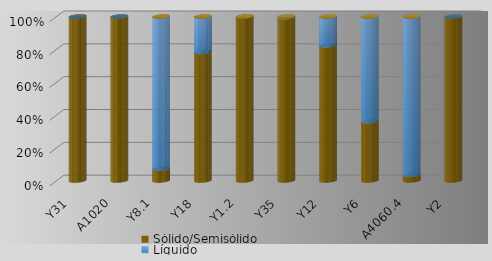
| Category | Sólido/Semisólido | Líquido | Gaseoso |
|---|---|---|---|
| Y31 | 4799146.4 | 124.2 | 0 |
| A1020 | 3295455.23 | 0 | 0 |
| Y8.1 | 146296.22 | 1872235.5 | 0 |
| Y18 | 1088424.21 | 301184.1 | 0 |
| Y1.2 | 1314656.85 | 1226.6 | 0 |
| Y35 | 1120455.35 | 5833.7 | 0 |
| Y12 | 496967.14 | 106088.51 | 0 |
| Y6 | 154066.89 | 272043.53 | 0 |
| A4060.4 | 12513.64 | 351247.29 | 0 |
| Y2 | 333540.15 | 98.4 | 0 |